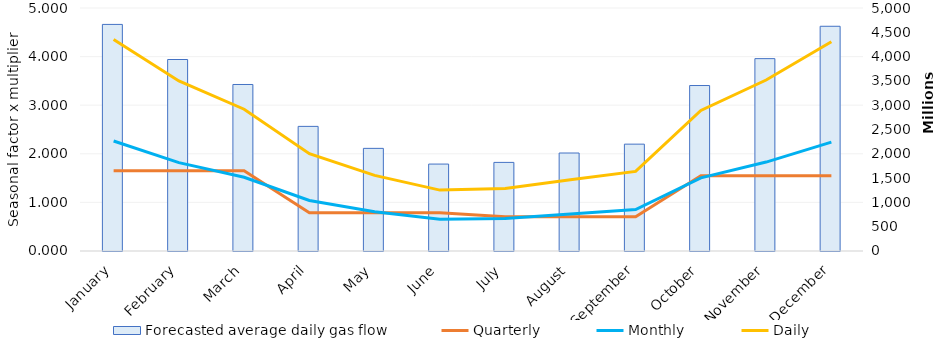
| Category | Forecasted average daily gas flow |
|---|---|
| 0 | 4662348882.594 |
| 1 | 3940197985.642 |
| 2 | 3426128759.832 |
| 3 | 2564057827.393 |
| 4 | 2111651767.239 |
| 5 | 1788620073.953 |
| 6 | 1823040730.933 |
| 7 | 2016199822.004 |
| 8 | 2198588612.463 |
| 9 | 3404876966.881 |
| 10 | 3958099524.115 |
| 11 | 4623932943.01 |